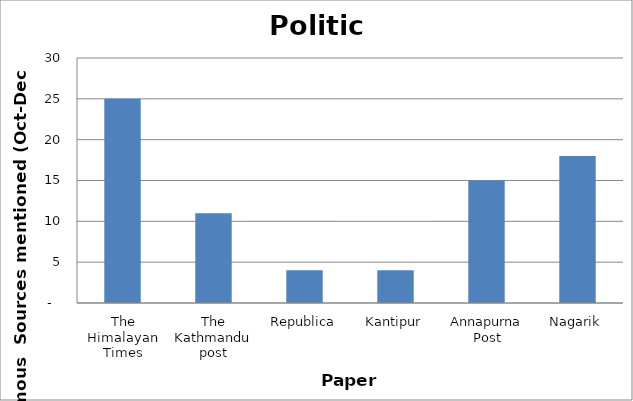
| Category | Politics |
|---|---|
| The Himalayan Times | 25 |
| The Kathmandu post | 11 |
| Republica | 4 |
| Kantipur | 4 |
| Annapurna Post | 15 |
| Nagarik | 18 |